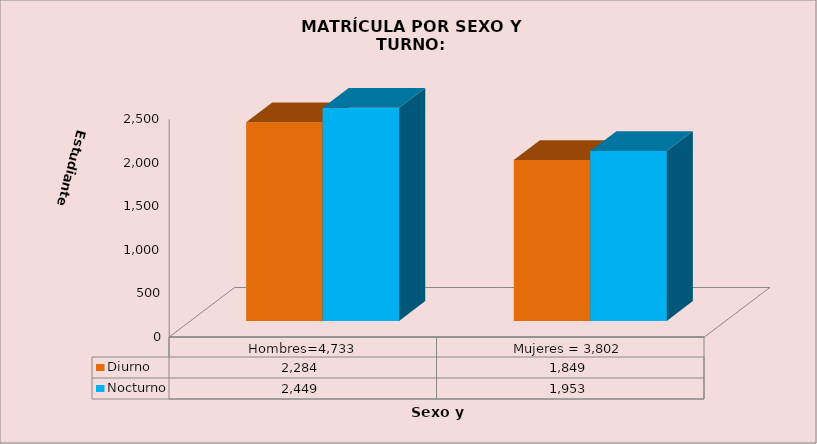
| Category | Diurno | Nocturno |
|---|---|---|
|  Hombres=4,733 | 2284 | 2449 |
| Mujeres = 3,802 | 1849 | 1953 |